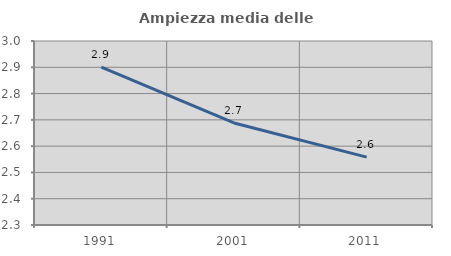
| Category | Ampiezza media delle famiglie |
|---|---|
| 1991.0 | 2.901 |
| 2001.0 | 2.688 |
| 2011.0 | 2.558 |